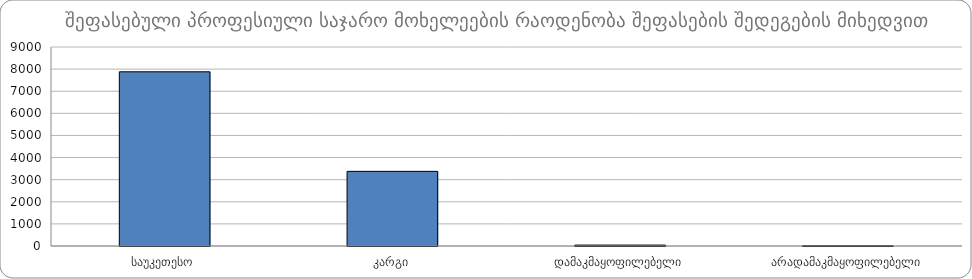
| Category | პროფესიული საჯარო მოხელეების რაოდენობა |
|---|---|
| საუკეთესო | 7878 |
| კარგი | 3376 |
| დამაკმაყოფილებელი | 41 |
| არადამაკმაყოფილებელი | 7 |